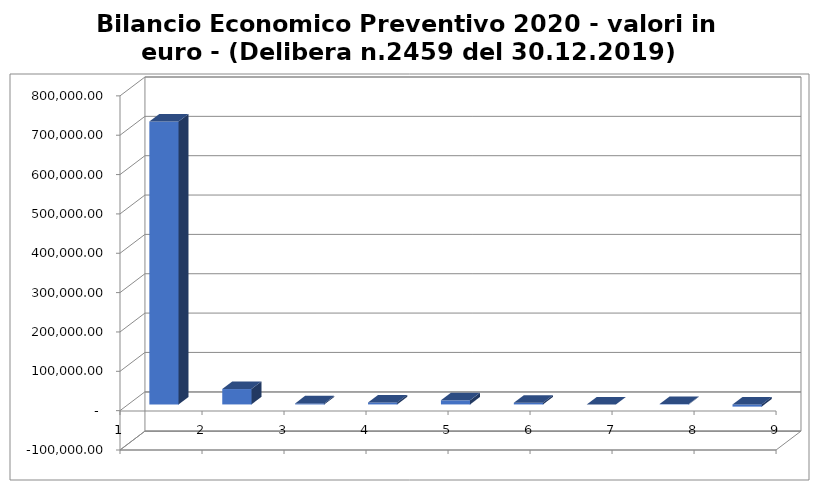
| Category | Bilancio Economico Preventivo 2020 - valori in euro - (Delibera n.2459 del 30.12.2019) |
|---|---|
| 0 | 718835.615 |
| 01/01/1900 | 39111 |
| 02/01/1900 | 2627.071 |
| 03/01/1900 | 5050.625 |
| 04/01/1900 | 10453.573 |
| 05/01/1900 | 4326.281 |
| 06/01/1900 | 0.004 |
| 07/01/1900 | 1000 |
| 08/01/1900 | -5539.3 |